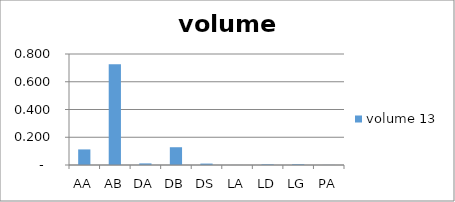
| Category |  volume 13  |
|---|---|
| AA | 0.112 |
| AB | 0.727 |
| DA | 0.012 |
| DB | 0.128 |
| DS | 0.01 |
| LA | 0 |
| LD | 0.005 |
| LG | 0.005 |
| PA | 0.001 |